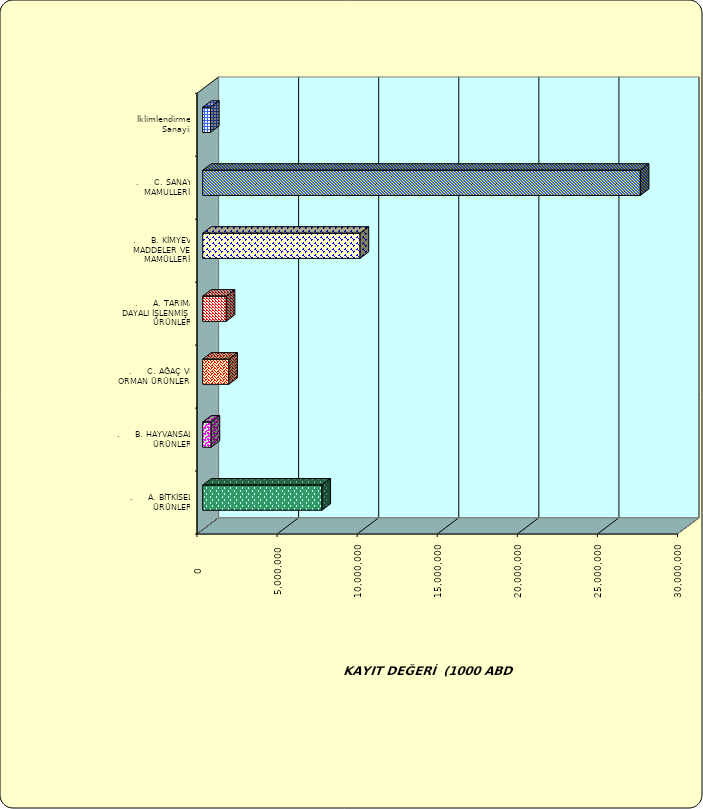
| Category | Series 0 |
|---|---|
| .     A. BİTKİSEL ÜRÜNLER | 7446088.954 |
| .     B. HAYVANSAL ÜRÜNLER | 525542.314 |
| .     C. AĞAÇ VE ORMAN ÜRÜNLERİ | 1631136.186 |
| .     A. TARIMA DAYALI İŞLENMİŞ ÜRÜNLER | 1468792.903 |
| .     B. KİMYEVİ MADDELER VE MAMÜLLERİ | 9827022.874 |
| .     C. SANAYİ MAMULLERİ | 27325026.484 |
|  İklimlendirme Sanayii | 487659.843 |